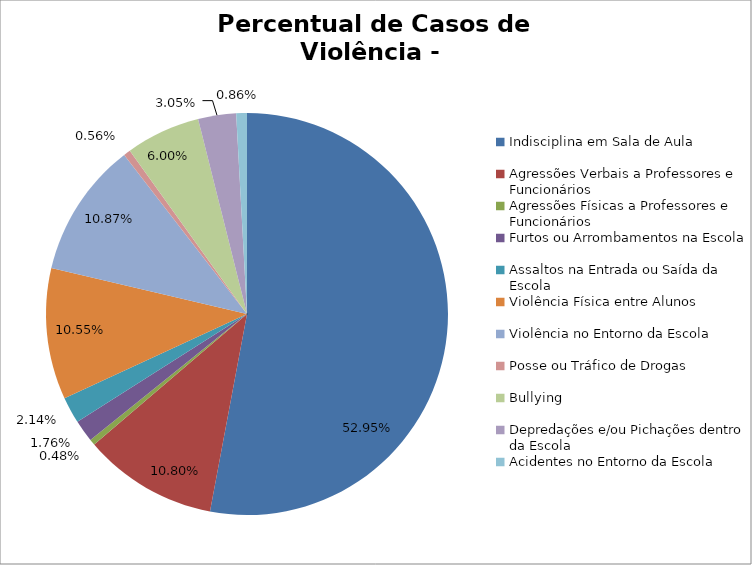
| Category | Percentual |
|---|---|
| Indisciplina em Sala de Aula | 0.53 |
| Agressões Verbais a Professores e Funcionários | 0.108 |
| Agressões Físicas a Professores e Funcionários | 0.005 |
| Furtos ou Arrombamentos na Escola | 0.018 |
| Assaltos na Entrada ou Saída da Escola | 0.021 |
| Violência Física entre Alunos | 0.105 |
| Violência no Entorno da Escola | 0.109 |
| Posse ou Tráfico de Drogas | 0.006 |
| Bullying | 0.06 |
| Depredações e/ou Pichações dentro da Escola | 0.031 |
| Acidentes no Entorno da Escola | 0.009 |